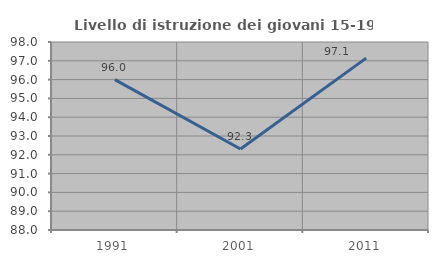
| Category | Livello di istruzione dei giovani 15-19 anni |
|---|---|
| 1991.0 | 96 |
| 2001.0 | 92.308 |
| 2011.0 | 97.143 |